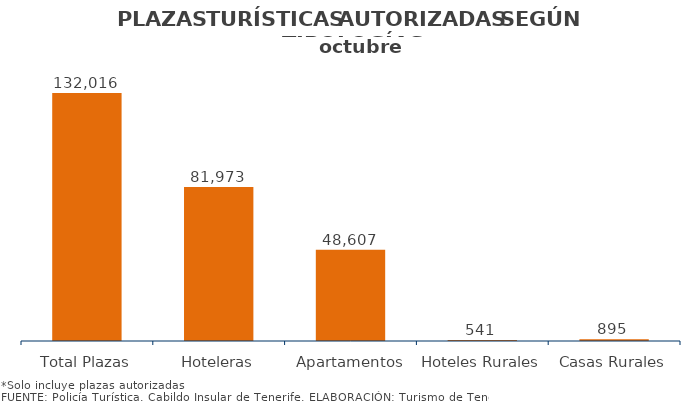
| Category | PLAZAS TURISTICAS AUTORIZADAS SEGÚN TIPOLOGÍA DEL ESTABLECIMIENTO.
Municipios e Isla octubre 2014 |
|---|---|
| Total Plazas | 132016 |
| Hoteleras | 81973 |
| Apartamentos | 48607 |
| Hoteles Rurales | 541 |
| Casas Rurales | 895 |